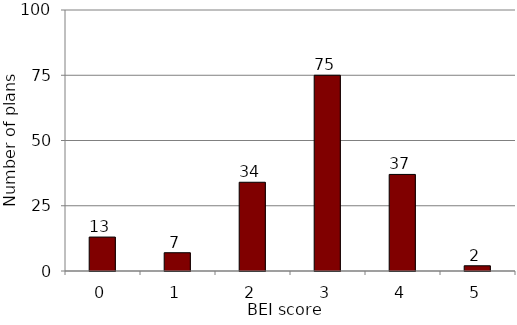
| Category | Series 0 |
|---|---|
| 0.0 | 13 |
| 1.0 | 7 |
| 2.0 | 34 |
| 3.0 | 75 |
| 4.0 | 37 |
| 5.0 | 2 |